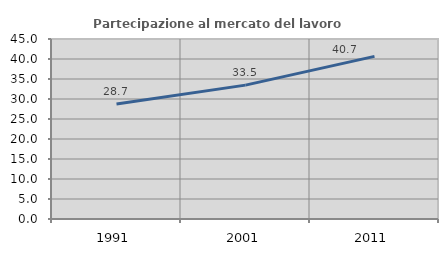
| Category | Partecipazione al mercato del lavoro  femminile |
|---|---|
| 1991.0 | 28.726 |
| 2001.0 | 33.465 |
| 2011.0 | 40.656 |